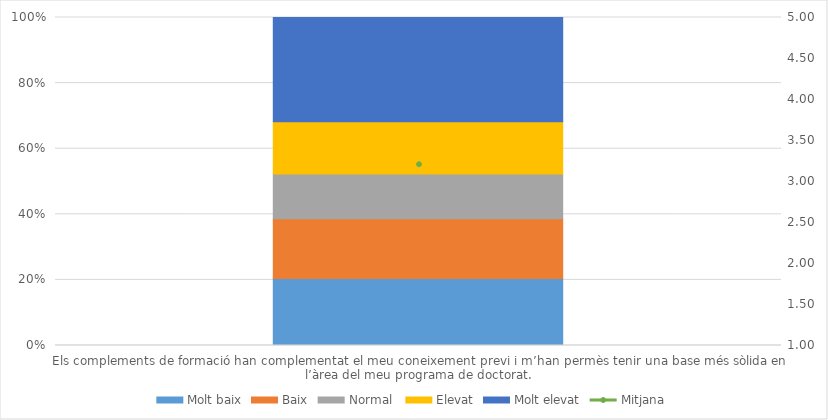
| Category | Molt baix | Baix | Normal  | Elevat | Molt elevat |
|---|---|---|---|---|---|
| Els complements de formació han complementat el meu coneixement previ i m’han permès tenir una base més sòlida en l’àrea del meu programa de doctorat. | 9 | 8 | 6 | 7 | 14 |